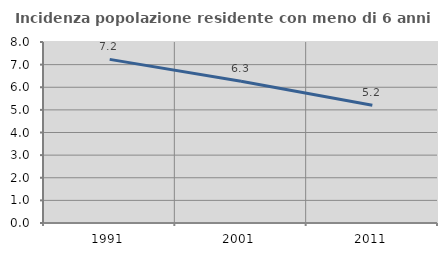
| Category | Incidenza popolazione residente con meno di 6 anni |
|---|---|
| 1991.0 | 7.231 |
| 2001.0 | 6.269 |
| 2011.0 | 5.206 |